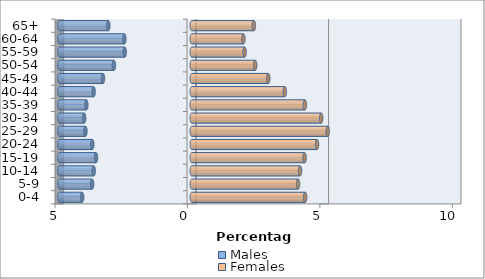
| Category | Males | Females |
|---|---|---|
| 0-4 | -4.138 | 4.279 |
| 5-9 | -3.763 | 4.014 |
| 10-14 | -3.702 | 4.088 |
| 15-19 | -3.615 | 4.26 |
| 20-24 | -3.756 | 4.73 |
| 25-29 | -4.016 | 5.133 |
| 30-34 | -4.063 | 4.886 |
| 35-39 | -3.98 | 4.269 |
| 40-44 | -3.706 | 3.513 |
| 45-49 | -3.352 | 2.888 |
| 50-54 | -2.94 | 2.393 |
| 55-59 | -2.533 | 1.995 |
| 60-64 | -2.545 | 1.948 |
| 65+ | -3.151 | 2.344 |